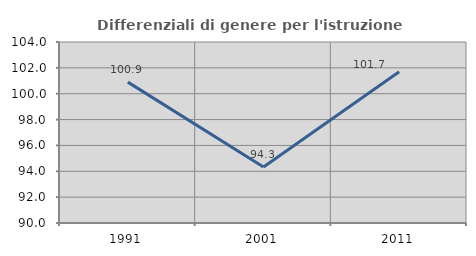
| Category | Differenziali di genere per l'istruzione superiore |
|---|---|
| 1991.0 | 100.895 |
| 2001.0 | 94.337 |
| 2011.0 | 101.702 |